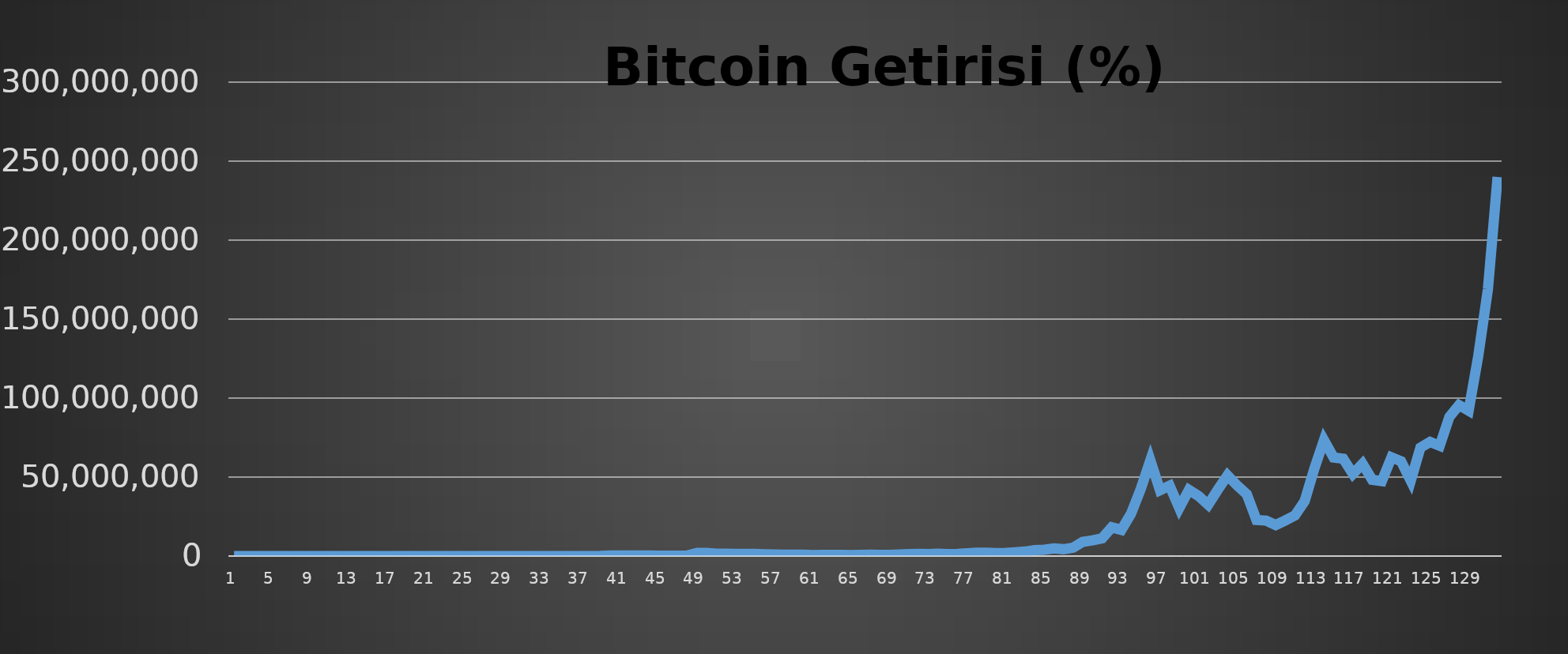
| Category | Series 0 |
|---|---|
| 0 | 100 |
| 1 | 103.021 |
| 2 | 101.49 |
| 3 | 99.465 |
| 4 | 105.126 |
| 5 | 105.707 |
| 6 | 100.648 |
| 7 | 101.684 |
| 8 | 96.438 |
| 9 | 95.736 |
| 10 | 837.677 |
| 11 | 855.833 |
| 12 | 893.315 |
| 13 | 889.806 |
| 14 | 860.177 |
| 15 | 846.867 |
| 16 | 887.244 |
| 17 | 902.281 |
| 18 | 939.818 |
| 19 | 954.744 |
| 20 | 1035.387 |
| 21 | 985.598 |
| 22 | 2035.465 |
| 23 | 4197.019 |
| 24 | 5934.973 |
| 25 | 7784.09 |
| 26 | 9916.126 |
| 27 | 11731.605 |
| 28 | 14542.204 |
| 29 | 16107.287 |
| 30 | 17975.339 |
| 31 | 20234.356 |
| 32 | 21985.787 |
| 33 | 23947.069 |
| 34 | 25851.434 |
| 35 | 27783.867 |
| 36 | 29354.073 |
| 37 | 32041.703 |
| 38 | 96638.375 |
| 39 | 361080.666 |
| 40 | 380063.713 |
| 41 | 392751.454 |
| 42 | 396229.811 |
| 43 | 420019.938 |
| 44 | 282923.879 |
| 45 | 282184.5 |
| 46 | 287657.11 |
| 47 | 317767.159 |
| 48 | 2053679.075 |
| 49 | 2019715.966 |
| 50 | 1474725.545 |
| 51 | 1455695.939 |
| 52 | 1393718.171 |
| 53 | 1398911.426 |
| 54 | 1388073.284 |
| 55 | 1151138.141 |
| 56 | 988190.147 |
| 57 | 834107.95 |
| 58 | 927805.066 |
| 59 | 834287.721 |
| 60 | 590750.384 |
| 61 | 705596.739 |
| 62 | 705299.419 |
| 63 | 702801.421 |
| 64 | 678205.418 |
| 65 | 783862.695 |
| 66 | 877299.338 |
| 67 | 745589.461 |
| 68 | 796014.468 |
| 69 | 1014342.322 |
| 70 | 1221986.938 |
| 71 | 1395615.837 |
| 72 | 1208894.374 |
| 73 | 1436303.277 |
| 74 | 1298876.785 |
| 75 | 1393639.294 |
| 76 | 1746379.202 |
| 77 | 2134782.44 |
| 78 | 2071325.102 |
| 79 | 1879867.841 |
| 80 | 2027647.92 |
| 81 | 2401236.638 |
| 82 | 2839987.302 |
| 83 | 3795981.21 |
| 84 | 4046491.261 |
| 85 | 4837719.254 |
| 86 | 4332598.857 |
| 87 | 5334640.255 |
| 88 | 9020235.737 |
| 89 | 9923475.874 |
| 90 | 11176161.444 |
| 91 | 18165735.235 |
| 92 | 16573273.407 |
| 93 | 26866619.127 |
| 94 | 42320947.225 |
| 95 | 60587409.042 |
| 96 | 41692099.91 |
| 97 | 44556995.38 |
| 98 | 30406352.469 |
| 99 | 41905340.278 |
| 100 | 37981921.607 |
| 101 | 32461752.748 |
| 102 | 42037585.317 |
| 103 | 51095056.339 |
| 104 | 44648020.673 |
| 105 | 39167272.654 |
| 106 | 22811856.68 |
| 107 | 22444071.365 |
| 108 | 19640434.946 |
| 109 | 22568177.955 |
| 110 | 25707307.804 |
| 111 | 34774591.186 |
| 112 | 55258345.532 |
| 113 | 73380963.089 |
| 114 | 62391888.071 |
| 115 | 61607608.635 |
| 116 | 51963347.368 |
| 117 | 58418814.336 |
| 118 | 48289428.034 |
| 119 | 47420950.818 |
| 120 | 62516857.76 |
| 121 | 59998687.938 |
| 122 | 47673455.746 |
| 123 | 68621782.297 |
| 124 | 72208002.121 |
| 125 | 69770002.116 |
| 126 | 88043630.455 |
| 127 | 95582148.079 |
| 128 | 92056762.848 |
| 129 | 126745973.401 |
| 130 | 168955646.149 |
| 131 | 239965247.611 |